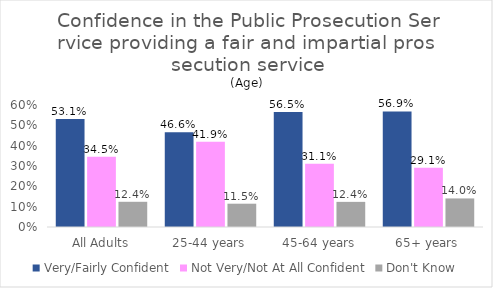
| Category | Very/Fairly Confident | Not Very/Not At All Confident | Don't Know |
|---|---|---|---|
| All Adults | 0.531 | 0.345 | 0.124 |
| 25-44 years | 0.466 | 0.419 | 0.115 |
| 45-64 years | 0.565 | 0.311 | 0.124 |
| 65+ years | 0.569 | 0.291 | 0.14 |